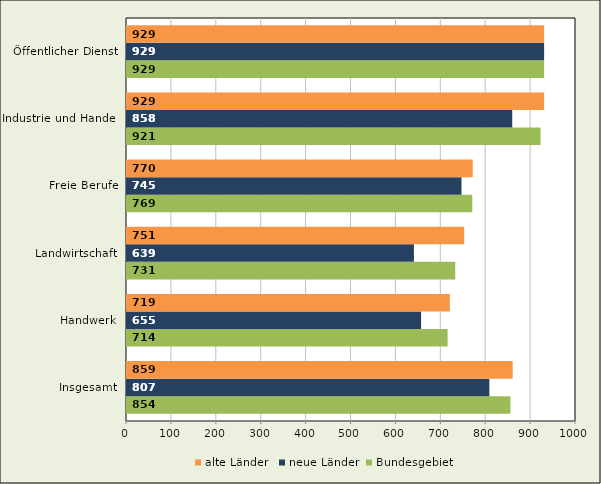
| Category | Bundesgebiet | neue Länder | alte Länder  |
|---|---|---|---|
| Insgesamt | 854 | 807 | 859 |
| Handwerk | 714 | 655 | 719 |
| Landwirtschaft | 731 | 639 | 751 |
| Freie Berufe | 769 | 745 | 770 |
| Industrie und Handel | 921 | 858 | 929 |
| Öffentlicher Dienst | 929 | 929 | 929 |